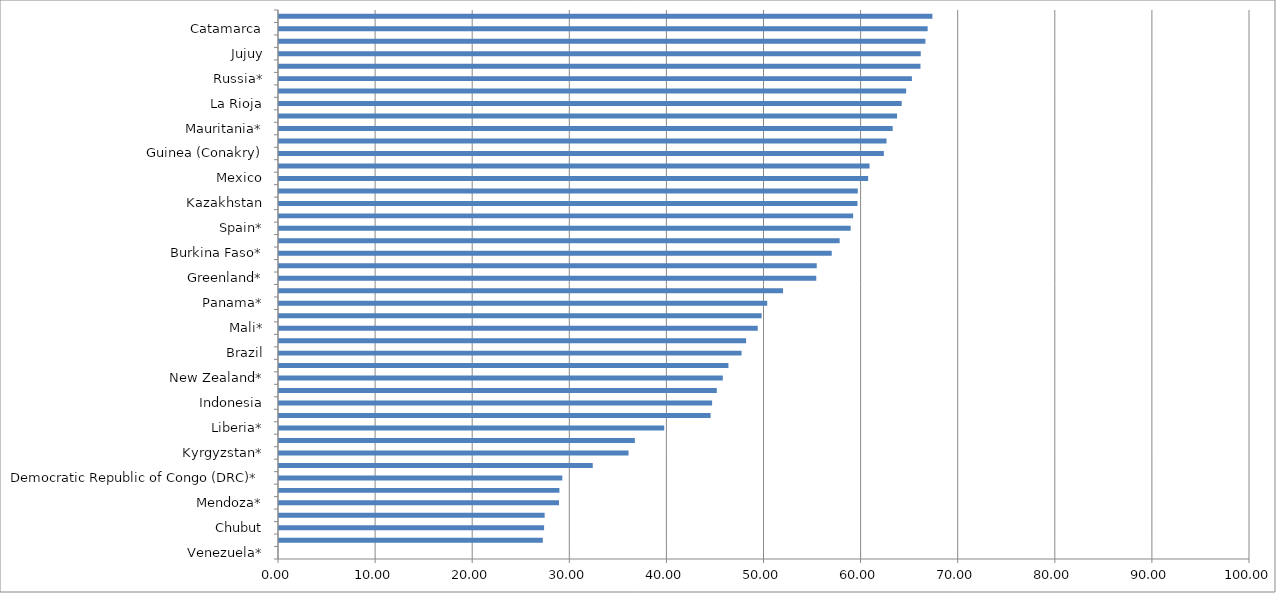
| Category | Series 0 |
|---|---|
| Venezuela* | 0 |
| Philippines* | 27.17 |
| Chubut | 27.301 |
| Nicaragua* | 27.359 |
| Mendoza* | 28.838 |
| Zimbabwe* | 28.88 |
| Democratic Republic of Congo (DRC)* | 29.179 |
| Bolivia | 32.312 |
| Kyrgyzstan* | 35.999 |
| Mongolia* | 36.648 |
| Liberia* | 39.671 |
| China* | 44.448 |
| Indonesia | 44.605 |
| Papua New Guinea | 45.088 |
| New Zealand* | 45.707 |
| Peru | 46.285 |
| Brazil | 47.637 |
| Guyana* | 48.105 |
| Mali* | 49.304 |
| South Africa* | 49.705 |
| Panama* | 50.279 |
| Tanzania | 51.911 |
| Greenland* | 55.331 |
| Turkey | 55.38 |
| Burkina Faso* | 56.925 |
| Northwest Territories | 57.74 |
| Spain* | 58.876 |
| Manitoba | 59.129 |
| Kazakhstan | 59.574 |
| California | 59.605 |
| Mexico | 60.674 |
| Minnesota* | 60.819 |
| Guinea (Conakry) | 62.292 |
| Colombia | 62.567 |
| Mauritania* | 63.2 |
| Niger* | 63.651 |
| La Rioja | 64.129 |
| Ghana | 64.591 |
| Russia* | 65.182 |
| Ecuador | 66.062 |
| Jujuy | 66.091 |
| Victoria | 66.573 |
| Catamarca | 66.803 |
| Rio Negro* | 67.293 |